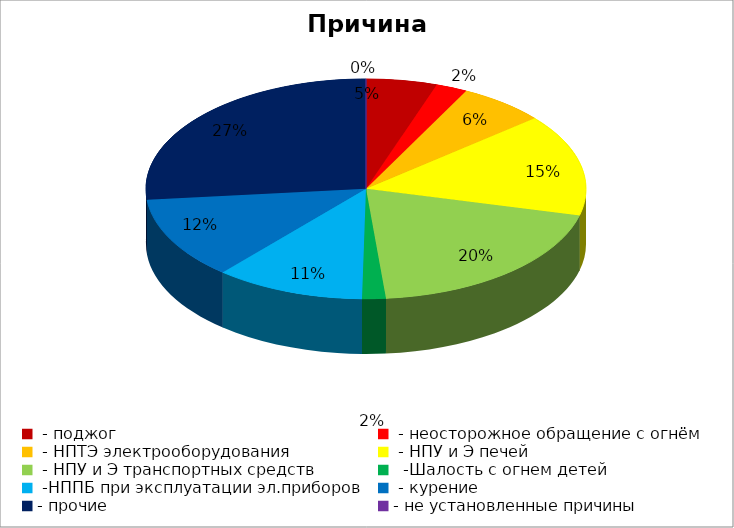
| Category | Причина пожара |
|---|---|
|  - поджог | 9 |
|  - неосторожное обращение с огнём | 4 |
|  - НПТЭ электрооборудования | 11 |
|  - НПУ и Э печей | 26 |
|  - НПУ и Э транспортных средств | 34 |
|   -Шалость с огнем детей | 3 |
|  -НППБ при эксплуатации эл.приборов | 19 |
|  - курение | 21 |
| - прочие | 46 |
| - не установленные причины | 0 |